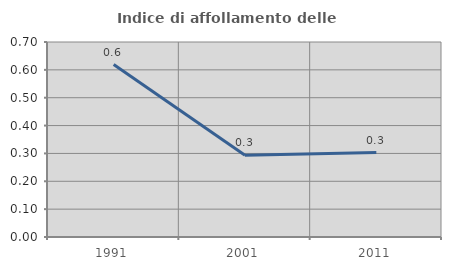
| Category | Indice di affollamento delle abitazioni  |
|---|---|
| 1991.0 | 0.619 |
| 2001.0 | 0.293 |
| 2011.0 | 0.303 |